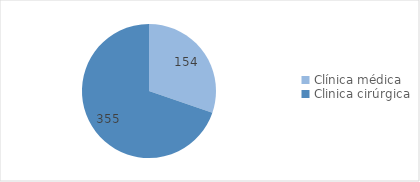
| Category | Series 0 |
|---|---|
| Clínica médica | 154 |
| Clinica cirúrgica | 355 |